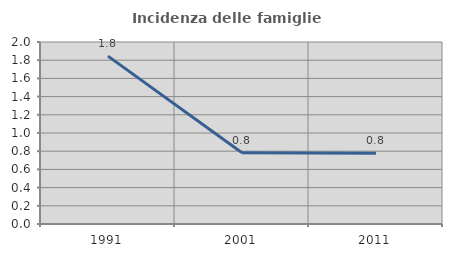
| Category | Incidenza delle famiglie numerose |
|---|---|
| 1991.0 | 1.845 |
| 2001.0 | 0.782 |
| 2011.0 | 0.777 |